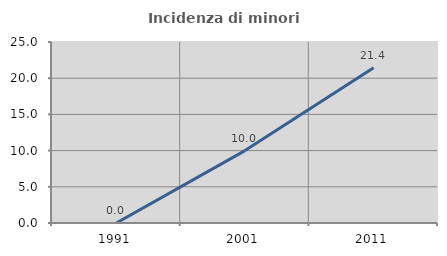
| Category | Incidenza di minori stranieri |
|---|---|
| 1991.0 | 0 |
| 2001.0 | 10 |
| 2011.0 | 21.429 |